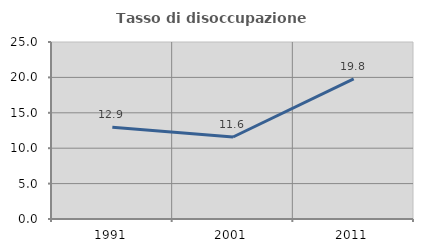
| Category | Tasso di disoccupazione giovanile  |
|---|---|
| 1991.0 | 12.943 |
| 2001.0 | 11.581 |
| 2011.0 | 19.782 |